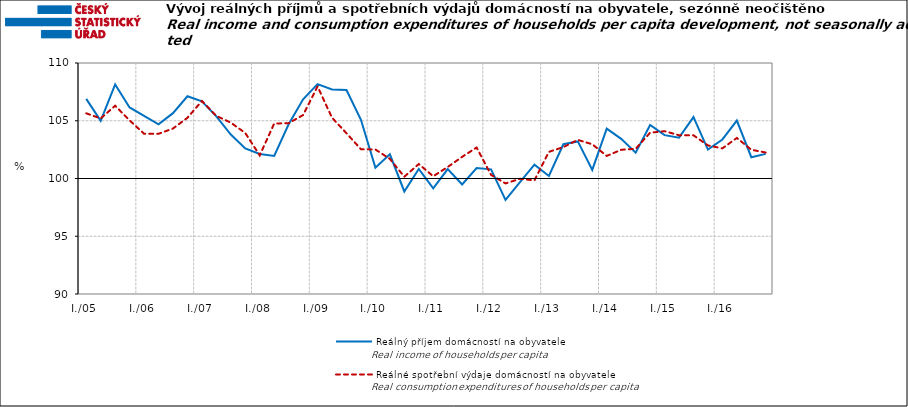
| Category | Reálný příjem domácností na obyvatele | Reálné spotřební výdaje domácností na obyvatele |
|---|---|---|
| I./05 | 106.898 | 105.642 |
|  | 104.998 | 105.199 |
|  | 108.15 | 106.3 |
|  | 106.155 | 105.031 |
| I./06 | 105.431 | 103.879 |
|  | 104.685 | 103.87 |
|  | 105.658 | 104.326 |
|  | 107.121 | 105.256 |
| I./07 | 106.684 | 106.711 |
|  | 105.383 | 105.42 |
|  | 103.807 | 104.837 |
|  | 102.598 | 103.939 |
| I./08 | 102.123 | 102.003 |
|  | 101.955 | 104.757 |
|  | 104.7 | 104.794 |
|  | 106.862 | 105.492 |
| I./09 | 108.173 | 107.97 |
|  | 107.713 | 105.261 |
|  | 107.657 | 103.919 |
|  | 105.084 | 102.535 |
| I./10 | 100.941 | 102.513 |
|  | 102.091 | 101.699 |
|  | 98.879 | 100.155 |
|  | 100.825 | 101.253 |
| I./11 | 99.141 | 100.195 |
|  | 100.817 | 100.995 |
|  | 99.488 | 101.876 |
|  | 100.901 | 102.682 |
| I./12 | 100.794 | 100.316 |
|  | 98.144 | 99.573 |
|  | 99.679 | 99.975 |
|  | 101.203 | 99.837 |
| I./13 | 100.22 | 102.304 |
|  | 102.967 | 102.721 |
|  | 103.21 | 103.342 |
|  | 100.746 | 102.966 |
| I./14 | 104.315 | 101.952 |
|  | 103.429 | 102.488 |
|  | 102.237 | 102.572 |
|  | 104.631 | 103.961 |
| I./15 | 103.755 | 104.1 |
|  | 103.538 | 103.744 |
|  | 105.317 | 103.739 |
|  | 102.506 | 102.864 |
| I./16 | 103.38 | 102.608 |